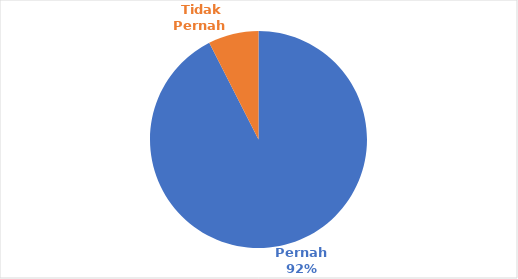
| Category | 2. Pelatihan Perikanan Tangkap  |
|---|---|
| Pernah  | 37 |
| Tidak Pernah  | 3 |